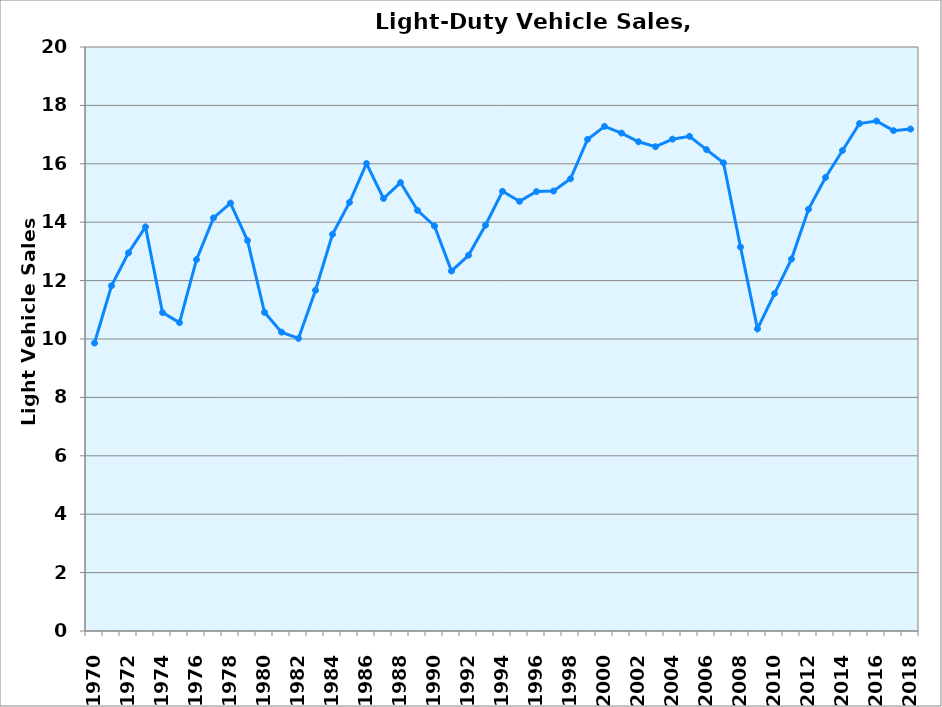
| Category | Sales (Millions) |
|---|---|
| 1970.0 | 9.862 |
| 1971.0 | 11.823 |
| 1972.0 | 12.953 |
| 1973.0 | 13.838 |
| 1974.0 | 10.904 |
| 1975.0 | 10.562 |
| 1976.0 | 12.719 |
| 1977.0 | 14.149 |
| 1978.0 | 14.654 |
| 1979.0 | 13.372 |
| 1980.0 | 10.913 |
| 1981.0 | 10.235 |
| 1982.0 | 10.02 |
| 1983.0 | 11.669 |
| 1984.0 | 13.585 |
| 1985.0 | 14.678 |
| 1986.0 | 16.01 |
| 1987.0 | 14.811 |
| 1988.0 | 15.358 |
| 1989.0 | 14.405 |
| 1990.0 | 13.87 |
| 1991.0 | 12.328 |
| 1992.0 | 12.868 |
| 1993.0 | 13.896 |
| 1994.0 | 15.059 |
| 1995.0 | 14.713 |
| 1996.0 | 15.05 |
| 1997.0 | 15.067 |
| 1998.0 | 15.486 |
| 1999.0 | 16.833 |
| 2000.0 | 17.281 |
| 2001.0 | 17.052 |
| 2002.0 | 16.755 |
| 2003.0 | 16.585 |
| 2004.0 | 16.844 |
| 2005.0 | 16.941 |
| 2006.0 | 16.486 |
| 2007.0 | 16.033 |
| 2008.0 | 13.15 |
| 2009.0 | 10.348 |
| 2010.0 | 11.555 |
| 2011.0 | 12.737 |
| 2012.0 | 14.443 |
| 2013.0 | 15.533 |
| 2014.0 | 16.456 |
| 2015.0 | 17.378 |
| 2016.0 | 17.465 |
| 2017.0 | 17.135 |
| 2018.0 | 17.19 |